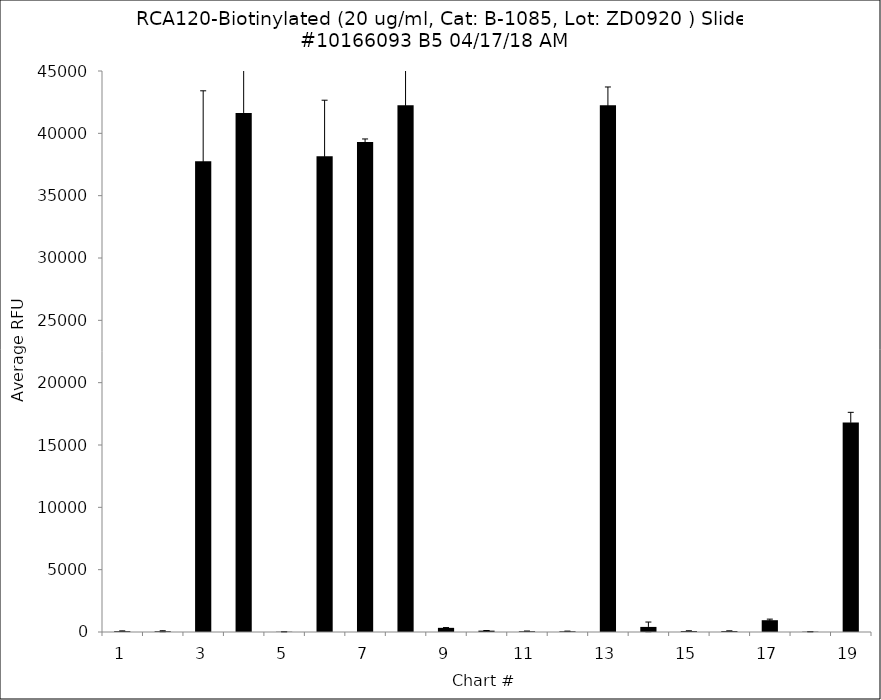
| Category | Series 0 |
|---|---|
| 1.0 | 67.5 |
| 2.0 | 60.25 |
| 3.0 | 37768.75 |
| 4.0 | 41635 |
| 5.0 | 19.75 |
| 6.0 | 38163.25 |
| 7.0 | 39300.5 |
| 8.0 | 42259.75 |
| 9.0 | 333.25 |
| 10.0 | 108.5 |
| 11.0 | 61.25 |
| 12.0 | 57.25 |
| 13.0 | 42262.5 |
| 14.0 | 407.75 |
| 15.0 | 75.75 |
| 16.0 | 75 |
| 17.0 | 945.75 |
| 18.0 | 24 |
| 19.0 | 16801 |